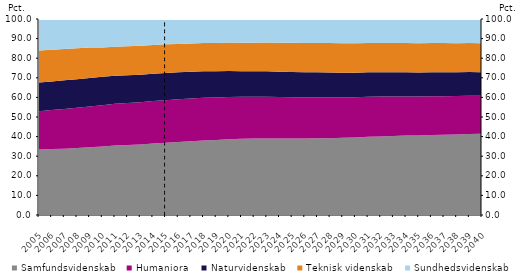
| Category | Samfundsvidenskab | Humaniora | Naturvidenskab | Teknisk videnskab | Sundhedsvidenskab |
|---|---|---|---|---|---|
| 2005.0 | 33.4 | 19.5 | 14.7 | 16.3 | 16.1 |
| 2006.0 | 33.7 | 19.9 | 14.5 | 16.2 | 15.7 |
| 2007.0 | 33.8 | 20.3 | 14.6 | 16 | 15.3 |
| 2008.0 | 34.2 | 20.5 | 14.6 | 15.8 | 14.8 |
| 2009.0 | 34.6 | 20.7 | 14.6 | 15.6 | 14.6 |
| 2010.0 | 35 | 21 | 14.5 | 15 | 14.5 |
| 2011.0 | 35.4 | 21.3 | 14.3 | 14.9 | 14.2 |
| 2012.0 | 35.7 | 21.4 | 14.2 | 14.8 | 14 |
| 2013.0 | 36 | 21.5 | 14.1 | 14.7 | 13.7 |
| 2014.0 | 36.5 | 21.6 | 14 | 14.6 | 13.4 |
| 2015.0 | 36.8 | 21.7 | 14 | 14.6 | 13 |
| 2016.0 | 37.2 | 21.8 | 13.8 | 14.5 | 12.7 |
| 2017.0 | 37.6 | 21.8 | 13.7 | 14.4 | 12.4 |
| 2018.0 | 38 | 21.8 | 13.6 | 14.4 | 12.3 |
| 2019.0 | 38.3 | 21.7 | 13.4 | 14.4 | 12.1 |
| 2020.0 | 38.6 | 21.6 | 13.3 | 14.5 | 12 |
| 2021.0 | 38.9 | 21.4 | 13.1 | 14.5 | 12 |
| 2022.0 | 39 | 21.3 | 13 | 14.6 | 12.1 |
| 2023.0 | 39 | 21.3 | 13 | 14.7 | 12.1 |
| 2024.0 | 39 | 21.2 | 12.9 | 14.8 | 12.1 |
| 2025.0 | 39 | 21.1 | 12.9 | 14.9 | 12.2 |
| 2026.0 | 39 | 21 | 12.8 | 15 | 12.2 |
| 2027.0 | 39.1 | 20.9 | 12.8 | 15 | 12.3 |
| 2028.0 | 39.2 | 20.8 | 12.7 | 15 | 12.3 |
| 2029.0 | 39.4 | 20.6 | 12.6 | 15 | 12.3 |
| 2030.0 | 39.6 | 20.5 | 12.5 | 15 | 12.3 |
| 2031.0 | 39.9 | 20.4 | 12.5 | 15 | 12.3 |
| 2032.0 | 40.1 | 20.3 | 12.4 | 15 | 12.3 |
| 2033.0 | 40.3 | 20.2 | 12.3 | 14.9 | 12.3 |
| 2034.0 | 40.5 | 20 | 12.3 | 14.9 | 12.3 |
| 2035.0 | 40.6 | 19.9 | 12.2 | 14.9 | 12.3 |
| 2036.0 | 40.8 | 19.8 | 12.2 | 14.9 | 12.3 |
| 2037.0 | 40.9 | 19.7 | 12.2 | 14.9 | 12.3 |
| 2038.0 | 41.1 | 19.6 | 12.1 | 14.8 | 12.3 |
| 2039.0 | 41.3 | 19.5 | 12.1 | 14.8 | 12.4 |
| 2040.0 | 41.4 | 19.4 | 12 | 14.8 | 12.4 |